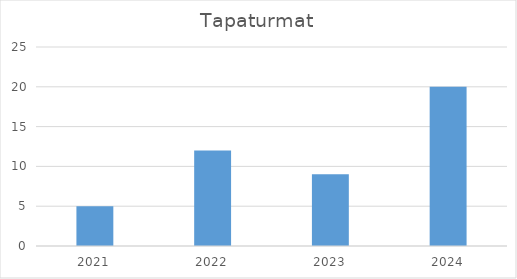
| Category | Tapaturmat |
|---|---|
| 2021.0 | 5 |
| 2022.0 | 12 |
| 2023.0 | 9 |
| 2024.0 | 20 |